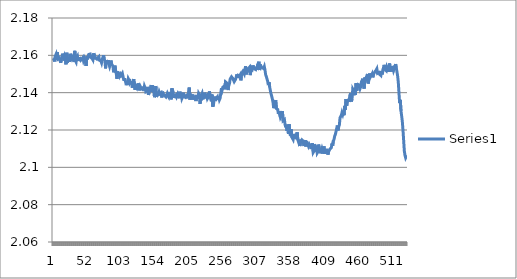
| Category | Series 0 |
|---|---|
| 0 | 2.158 |
| 1 | 2.158 |
| 2 | 2.157 |
| 3 | 2.16 |
| 4 | 2.16 |
| 5 | 2.158 |
| 6 | 2.162 |
| 7 | 2.158 |
| 8 | 2.158 |
| 9 | 2.158 |
| 10 | 2.159 |
| 11 | 2.156 |
| 12 | 2.158 |
| 13 | 2.158 |
| 14 | 2.161 |
| 15 | 2.159 |
| 16 | 2.16 |
| 17 | 2.157 |
| 18 | 2.158 |
| 19 | 2.155 |
| 20 | 2.161 |
| 21 | 2.156 |
| 22 | 2.156 |
| 23 | 2.159 |
| 24 | 2.156 |
| 25 | 2.161 |
| 26 | 2.16 |
| 27 | 2.158 |
| 28 | 2.159 |
| 29 | 2.159 |
| 30 | 2.157 |
| 31 | 2.156 |
| 32 | 2.162 |
| 33 | 2.157 |
| 34 | 2.156 |
| 35 | 2.159 |
| 36 | 2.16 |
| 37 | 2.157 |
| 38 | 2.158 |
| 39 | 2.158 |
| 40 | 2.158 |
| 41 | 2.157 |
| 42 | 2.158 |
| 43 | 2.158 |
| 44 | 2.159 |
| 45 | 2.157 |
| 46 | 2.158 |
| 47 | 2.156 |
| 48 | 2.158 |
| 49 | 2.154 |
| 50 | 2.16 |
| 51 | 2.158 |
| 52 | 2.158 |
| 53 | 2.16 |
| 54 | 2.16 |
| 55 | 2.161 |
| 56 | 2.159 |
| 57 | 2.159 |
| 58 | 2.158 |
| 59 | 2.158 |
| 60 | 2.161 |
| 61 | 2.159 |
| 62 | 2.16 |
| 63 | 2.158 |
| 64 | 2.158 |
| 65 | 2.158 |
| 66 | 2.159 |
| 67 | 2.158 |
| 68 | 2.159 |
| 69 | 2.157 |
| 70 | 2.157 |
| 71 | 2.157 |
| 72 | 2.156 |
| 73 | 2.158 |
| 74 | 2.159 |
| 75 | 2.16 |
| 76 | 2.158 |
| 77 | 2.157 |
| 78 | 2.153 |
| 79 | 2.157 |
| 80 | 2.156 |
| 81 | 2.155 |
| 82 | 2.157 |
| 83 | 2.155 |
| 84 | 2.154 |
| 85 | 2.155 |
| 86 | 2.157 |
| 87 | 2.156 |
| 88 | 2.155 |
| 89 | 2.154 |
| 90 | 2.151 |
| 91 | 2.152 |
| 92 | 2.154 |
| 93 | 2.152 |
| 94 | 2.15 |
| 95 | 2.147 |
| 96 | 2.151 |
| 97 | 2.149 |
| 98 | 2.151 |
| 99 | 2.149 |
| 100 | 2.15 |
| 101 | 2.149 |
| 102 | 2.149 |
| 103 | 2.15 |
| 104 | 2.149 |
| 105 | 2.147 |
| 106 | 2.147 |
| 107 | 2.147 |
| 108 | 2.148 |
| 109 | 2.144 |
| 110 | 2.146 |
| 111 | 2.144 |
| 112 | 2.147 |
| 113 | 2.147 |
| 114 | 2.145 |
| 115 | 2.146 |
| 116 | 2.144 |
| 117 | 2.146 |
| 118 | 2.143 |
| 119 | 2.143 |
| 120 | 2.147 |
| 121 | 2.144 |
| 122 | 2.142 |
| 123 | 2.144 |
| 124 | 2.144 |
| 125 | 2.142 |
| 126 | 2.143 |
| 127 | 2.145 |
| 128 | 2.142 |
| 129 | 2.141 |
| 130 | 2.143 |
| 131 | 2.142 |
| 132 | 2.142 |
| 133 | 2.142 |
| 134 | 2.143 |
| 135 | 2.141 |
| 136 | 2.144 |
| 137 | 2.143 |
| 138 | 2.141 |
| 139 | 2.14 |
| 140 | 2.141 |
| 141 | 2.143 |
| 142 | 2.139 |
| 143 | 2.14 |
| 144 | 2.14 |
| 145 | 2.142 |
| 146 | 2.144 |
| 147 | 2.14 |
| 148 | 2.144 |
| 149 | 2.141 |
| 150 | 2.142 |
| 151 | 2.138 |
| 152 | 2.139 |
| 153 | 2.144 |
| 154 | 2.138 |
| 155 | 2.139 |
| 156 | 2.138 |
| 157 | 2.139 |
| 158 | 2.14 |
| 159 | 2.139 |
| 160 | 2.139 |
| 161 | 2.14 |
| 162 | 2.137 |
| 163 | 2.14 |
| 164 | 2.14 |
| 165 | 2.139 |
| 166 | 2.138 |
| 167 | 2.138 |
| 168 | 2.138 |
| 169 | 2.138 |
| 170 | 2.14 |
| 171 | 2.138 |
| 172 | 2.138 |
| 173 | 2.14 |
| 174 | 2.139 |
| 175 | 2.138 |
| 176 | 2.136 |
| 177 | 2.142 |
| 178 | 2.142 |
| 179 | 2.14 |
| 180 | 2.137 |
| 181 | 2.138 |
| 182 | 2.138 |
| 183 | 2.139 |
| 184 | 2.138 |
| 185 | 2.138 |
| 186 | 2.14 |
| 187 | 2.139 |
| 188 | 2.137 |
| 189 | 2.14 |
| 190 | 2.138 |
| 191 | 2.14 |
| 192 | 2.137 |
| 193 | 2.138 |
| 194 | 2.14 |
| 195 | 2.138 |
| 196 | 2.138 |
| 197 | 2.138 |
| 198 | 2.139 |
| 199 | 2.137 |
| 200 | 2.139 |
| 201 | 2.137 |
| 202 | 2.137 |
| 203 | 2.143 |
| 204 | 2.136 |
| 205 | 2.139 |
| 206 | 2.138 |
| 207 | 2.136 |
| 208 | 2.139 |
| 209 | 2.136 |
| 210 | 2.138 |
| 211 | 2.136 |
| 212 | 2.138 |
| 213 | 2.136 |
| 214 | 2.139 |
| 215 | 2.138 |
| 216 | 2.137 |
| 217 | 2.14 |
| 218 | 2.139 |
| 219 | 2.134 |
| 220 | 2.137 |
| 221 | 2.139 |
| 222 | 2.14 |
| 223 | 2.137 |
| 224 | 2.137 |
| 225 | 2.138 |
| 226 | 2.14 |
| 227 | 2.138 |
| 228 | 2.137 |
| 229 | 2.138 |
| 230 | 2.137 |
| 231 | 2.137 |
| 232 | 2.138 |
| 233 | 2.141 |
| 234 | 2.138 |
| 235 | 2.136 |
| 236 | 2.135 |
| 237 | 2.139 |
| 238 | 2.132 |
| 239 | 2.134 |
| 240 | 2.136 |
| 241 | 2.138 |
| 242 | 2.136 |
| 243 | 2.137 |
| 244 | 2.137 |
| 245 | 2.138 |
| 246 | 2.136 |
| 247 | 2.138 |
| 248 | 2.136 |
| 249 | 2.137 |
| 250 | 2.14 |
| 251 | 2.142 |
| 252 | 2.141 |
| 253 | 2.143 |
| 254 | 2.143 |
| 255 | 2.144 |
| 256 | 2.142 |
| 257 | 2.146 |
| 258 | 2.146 |
| 259 | 2.145 |
| 260 | 2.146 |
| 261 | 2.141 |
| 262 | 2.144 |
| 263 | 2.145 |
| 264 | 2.147 |
| 265 | 2.148 |
| 266 | 2.148 |
| 267 | 2.149 |
| 268 | 2.148 |
| 269 | 2.147 |
| 270 | 2.146 |
| 271 | 2.146 |
| 272 | 2.147 |
| 273 | 2.148 |
| 274 | 2.15 |
| 275 | 2.148 |
| 276 | 2.149 |
| 277 | 2.149 |
| 278 | 2.149 |
| 279 | 2.15 |
| 280 | 2.147 |
| 281 | 2.15 |
| 282 | 2.151 |
| 283 | 2.151 |
| 284 | 2.151 |
| 285 | 2.15 |
| 286 | 2.15 |
| 287 | 2.154 |
| 288 | 2.15 |
| 289 | 2.151 |
| 290 | 2.151 |
| 291 | 2.153 |
| 292 | 2.153 |
| 293 | 2.154 |
| 294 | 2.149 |
| 295 | 2.153 |
| 296 | 2.153 |
| 297 | 2.153 |
| 298 | 2.155 |
| 299 | 2.153 |
| 300 | 2.153 |
| 301 | 2.153 |
| 302 | 2.152 |
| 303 | 2.154 |
| 304 | 2.152 |
| 305 | 2.155 |
| 306 | 2.155 |
| 307 | 2.157 |
| 308 | 2.152 |
| 309 | 2.155 |
| 310 | 2.154 |
| 311 | 2.154 |
| 312 | 2.153 |
| 313 | 2.154 |
| 314 | 2.153 |
| 315 | 2.154 |
| 316 | 2.152 |
| 317 | 2.15 |
| 318 | 2.149 |
| 319 | 2.149 |
| 320 | 2.146 |
| 321 | 2.144 |
| 322 | 2.146 |
| 323 | 2.143 |
| 324 | 2.141 |
| 325 | 2.139 |
| 326 | 2.138 |
| 327 | 2.137 |
| 328 | 2.135 |
| 329 | 2.132 |
| 330 | 2.132 |
| 331 | 2.135 |
| 332 | 2.136 |
| 333 | 2.132 |
| 334 | 2.132 |
| 335 | 2.131 |
| 336 | 2.129 |
| 337 | 2.13 |
| 338 | 2.13 |
| 339 | 2.127 |
| 340 | 2.128 |
| 341 | 2.128 |
| 342 | 2.13 |
| 343 | 2.125 |
| 344 | 2.125 |
| 345 | 2.126 |
| 346 | 2.123 |
| 347 | 2.121 |
| 348 | 2.123 |
| 349 | 2.12 |
| 350 | 2.123 |
| 351 | 2.118 |
| 352 | 2.123 |
| 353 | 2.118 |
| 354 | 2.117 |
| 355 | 2.12 |
| 356 | 2.116 |
| 357 | 2.116 |
| 358 | 2.115 |
| 359 | 2.117 |
| 360 | 2.117 |
| 361 | 2.117 |
| 362 | 2.117 |
| 363 | 2.115 |
| 364 | 2.119 |
| 365 | 2.115 |
| 366 | 2.114 |
| 367 | 2.115 |
| 368 | 2.111 |
| 369 | 2.113 |
| 370 | 2.114 |
| 371 | 2.115 |
| 372 | 2.115 |
| 373 | 2.114 |
| 374 | 2.111 |
| 375 | 2.111 |
| 376 | 2.115 |
| 377 | 2.111 |
| 378 | 2.114 |
| 379 | 2.113 |
| 380 | 2.114 |
| 381 | 2.111 |
| 382 | 2.112 |
| 383 | 2.111 |
| 384 | 2.113 |
| 385 | 2.11 |
| 386 | 2.11 |
| 387 | 2.113 |
| 388 | 2.108 |
| 389 | 2.109 |
| 390 | 2.112 |
| 391 | 2.112 |
| 392 | 2.108 |
| 393 | 2.112 |
| 394 | 2.108 |
| 395 | 2.108 |
| 396 | 2.112 |
| 397 | 2.111 |
| 398 | 2.11 |
| 399 | 2.108 |
| 400 | 2.108 |
| 401 | 2.11 |
| 402 | 2.11 |
| 403 | 2.107 |
| 404 | 2.111 |
| 405 | 2.107 |
| 406 | 2.109 |
| 407 | 2.109 |
| 408 | 2.109 |
| 409 | 2.109 |
| 410 | 2.107 |
| 411 | 2.108 |
| 412 | 2.108 |
| 413 | 2.11 |
| 414 | 2.11 |
| 415 | 2.11 |
| 416 | 2.113 |
| 417 | 2.112 |
| 418 | 2.114 |
| 419 | 2.115 |
| 420 | 2.117 |
| 421 | 2.118 |
| 422 | 2.119 |
| 423 | 2.121 |
| 424 | 2.122 |
| 425 | 2.12 |
| 426 | 2.122 |
| 427 | 2.123 |
| 428 | 2.126 |
| 429 | 2.127 |
| 430 | 2.128 |
| 431 | 2.129 |
| 432 | 2.128 |
| 433 | 2.13 |
| 434 | 2.128 |
| 435 | 2.133 |
| 436 | 2.131 |
| 437 | 2.136 |
| 438 | 2.133 |
| 439 | 2.136 |
| 440 | 2.136 |
| 441 | 2.136 |
| 442 | 2.135 |
| 443 | 2.139 |
| 444 | 2.14 |
| 445 | 2.135 |
| 446 | 2.137 |
| 447 | 2.142 |
| 448 | 2.141 |
| 449 | 2.139 |
| 450 | 2.142 |
| 451 | 2.139 |
| 452 | 2.145 |
| 453 | 2.141 |
| 454 | 2.144 |
| 455 | 2.144 |
| 456 | 2.144 |
| 457 | 2.144 |
| 458 | 2.142 |
| 459 | 2.143 |
| 460 | 2.146 |
| 461 | 2.147 |
| 462 | 2.148 |
| 463 | 2.147 |
| 464 | 2.142 |
| 465 | 2.148 |
| 466 | 2.146 |
| 467 | 2.148 |
| 468 | 2.148 |
| 469 | 2.15 |
| 470 | 2.145 |
| 471 | 2.147 |
| 472 | 2.15 |
| 473 | 2.148 |
| 474 | 2.148 |
| 475 | 2.149 |
| 476 | 2.15 |
| 477 | 2.148 |
| 478 | 2.15 |
| 479 | 2.15 |
| 480 | 2.151 |
| 481 | 2.151 |
| 482 | 2.152 |
| 483 | 2.153 |
| 484 | 2.15 |
| 485 | 2.15 |
| 486 | 2.151 |
| 487 | 2.15 |
| 488 | 2.15 |
| 489 | 2.149 |
| 490 | 2.152 |
| 491 | 2.15 |
| 492 | 2.15 |
| 493 | 2.154 |
| 494 | 2.155 |
| 495 | 2.153 |
| 496 | 2.153 |
| 497 | 2.152 |
| 498 | 2.154 |
| 499 | 2.153 |
| 500 | 2.153 |
| 501 | 2.151 |
| 502 | 2.156 |
| 503 | 2.152 |
| 504 | 2.153 |
| 505 | 2.151 |
| 506 | 2.154 |
| 507 | 2.153 |
| 508 | 2.152 |
| 509 | 2.153 |
| 510 | 2.154 |
| 511 | 2.155 |
| 512 | 2.153 |
| 513 | 2.154 |
| 514 | 2.149 |
| 515 | 2.146 |
| 516 | 2.145 |
| 517 | 2.134 |
| 518 | 2.136 |
| 519 | 2.13 |
| 520 | 2.128 |
| 521 | 2.125 |
| 522 | 2.12 |
| 523 | 2.114 |
| 524 | 2.109 |
| 525 | 2.106 |
| 526 | 2.105 |
| 527 | 2.106 |
| 528 | 2.106 |
| 529 | 2.107 |